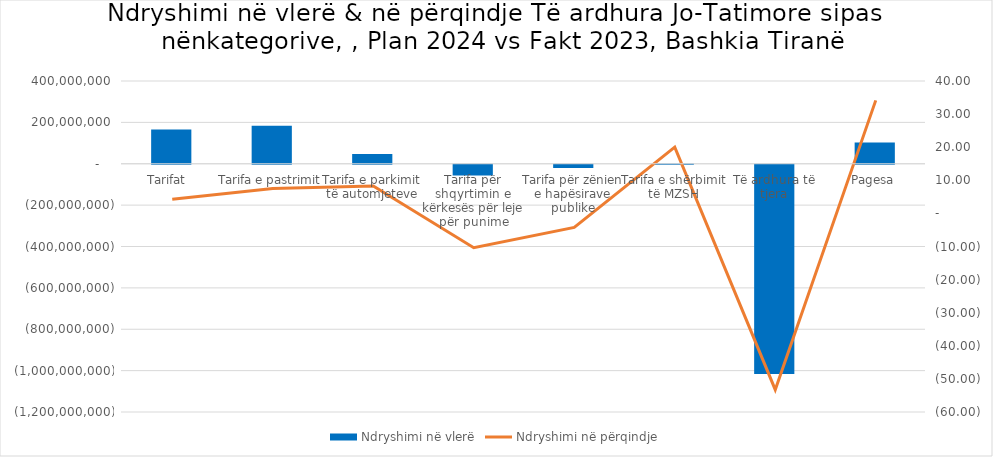
| Category | Ndryshimi në vlerë |
|---|---|
| Tarifat  | 165036970 |
| Tarifa e pastrimit | 183336845 |
| Tarifa e parkimit të automjeteve | 47620163 |
| Tarifa për shqyrtimin e kërkesës për leje për punime | -52042595 |
| Tarifa për zënien e hapësirave publike | -15496540 |
| Tarifa e shërbimit të MZSH | 1619097 |
| Të ardhura të tjera | -1011715601.667 |
| Pagesa | 102535688 |